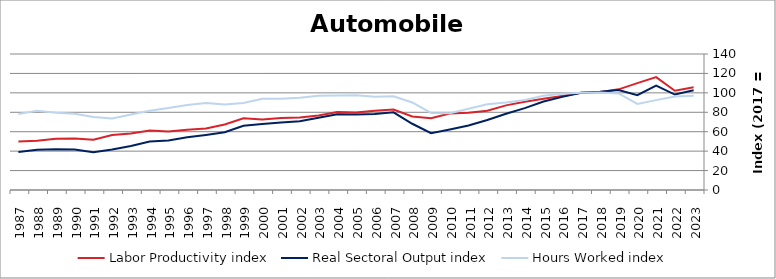
| Category | Labor Productivity index | Real Sectoral Output index | Hours Worked index |
|---|---|---|---|
| 2023.0 | 105.785 | 102.648 | 97.034 |
| 2022.0 | 102.122 | 98.255 | 96.214 |
| 2021.0 | 116.249 | 107.556 | 92.522 |
| 2020.0 | 110.009 | 97.536 | 88.662 |
| 2019.0 | 103.602 | 102.969 | 99.39 |
| 2018.0 | 100.698 | 101.191 | 100.49 |
| 2017.0 | 100 | 100 | 100 |
| 2016.0 | 96.871 | 95.882 | 98.979 |
| 2015.0 | 93.916 | 91.019 | 96.915 |
| 2014.0 | 90.916 | 84.268 | 92.688 |
| 2013.0 | 87.111 | 78.475 | 90.086 |
| 2012.0 | 81.559 | 72.041 | 88.33 |
| 2011.0 | 79.404 | 66.446 | 83.681 |
| 2010.0 | 78.772 | 62.296 | 79.084 |
| 2009.0 | 73.864 | 58.556 | 79.275 |
| 2008.0 | 75.648 | 68.189 | 90.14 |
| 2007.0 | 82.917 | 79.947 | 96.418 |
| 2006.0 | 81.459 | 78.249 | 96.06 |
| 2005.0 | 79.875 | 77.819 | 97.426 |
| 2004.0 | 80.207 | 77.971 | 97.212 |
| 2003.0 | 76.777 | 74.399 | 96.903 |
| 2002.0 | 74.545 | 70.821 | 95.005 |
| 2001.0 | 74.002 | 69.497 | 93.912 |
| 2000.0 | 72.476 | 68 | 93.824 |
| 1999.0 | 73.818 | 66.104 | 89.55 |
| 1998.0 | 67.457 | 59.392 | 88.044 |
| 1997.0 | 63.282 | 56.709 | 89.612 |
| 1996.0 | 62.026 | 54.272 | 87.499 |
| 1995.0 | 60.222 | 50.885 | 84.495 |
| 1994.0 | 61.254 | 49.967 | 81.574 |
| 1993.0 | 58.242 | 45.28 | 77.745 |
| 1992.0 | 56.536 | 41.667 | 73.7 |
| 1991.0 | 51.838 | 38.898 | 75.038 |
| 1990.0 | 53.07 | 41.714 | 78.602 |
| 1989.0 | 52.829 | 41.997 | 79.497 |
| 1988.0 | 50.774 | 41.38 | 81.498 |
| 1987.0 | 49.882 | 39.055 | 78.295 |